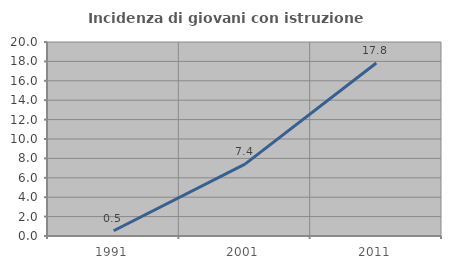
| Category | Incidenza di giovani con istruzione universitaria |
|---|---|
| 1991.0 | 0.538 |
| 2001.0 | 7.407 |
| 2011.0 | 17.84 |